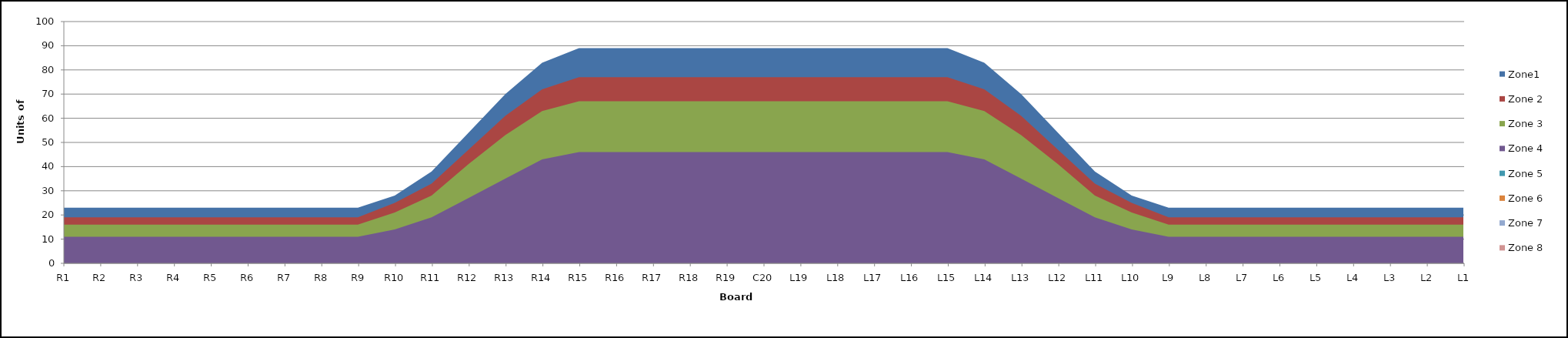
| Category | Zone1 | Zone 2 | Zone 3 | Zone 4 | Zone 5 | Zone 6 | Zone 7 | Zone 8 |
|---|---|---|---|---|---|---|---|---|
| L1 | 23 | 19 | 16 | 11 | 0 |  |  |  |
| L2 | 23 | 19 | 16 | 11 | 0 |  |  |  |
| L3 | 23 | 19 | 16 | 11 | 0 |  |  |  |
| L4 | 23 | 19 | 16 | 11 | 0 |  |  |  |
| L5 | 23 | 19 | 16 | 11 | 0 |  |  |  |
| L6 | 23 | 19 | 16 | 11 | 0 |  |  |  |
| L7 | 23 | 19 | 16 | 11 | 0 |  |  |  |
| L8 | 23 | 19 | 16 | 11 | 0 |  |  |  |
| L9 | 23 | 19 | 16 | 11 | 0 |  |  |  |
| L10 | 28 | 25 | 21 | 14 | 0 |  |  |  |
| L11 | 38 | 33 | 28 | 19 | 0 |  |  |  |
| L12 | 54 | 47 | 41 | 27 | 0 |  |  |  |
| L13 | 70 | 61 | 53 | 35 | 0 |  |  |  |
| L14 | 83 | 72 | 63 | 43 | 0 |  |  |  |
| L15 | 89 | 77 | 67 | 46 | 0 |  |  |  |
| L16 | 89 | 77 | 67 | 46 | 0 |  |  |  |
| L17 | 89 | 77 | 67 | 46 | 0 |  |  |  |
| L18 | 89 | 77 | 67 | 46 | 0 |  |  |  |
| L19 | 89 | 77 | 67 | 46 | 0 |  |  |  |
| C20 | 89 | 77 | 67 | 46 | 0 |  |  |  |
| R19 | 89 | 77 | 67 | 46 | 0 |  |  |  |
| R18 | 89 | 77 | 67 | 46 | 0 |  |  |  |
| R17 | 89 | 77 | 67 | 46 | 0 |  |  |  |
| R16 | 89 | 77 | 67 | 46 | 0 |  |  |  |
| R15 | 89 | 77 | 67 | 46 | 0 |  |  |  |
| R14 | 83 | 72 | 63 | 43 | 0 |  |  |  |
| R13 | 70 | 61 | 53 | 35 | 0 |  |  |  |
| R12 | 54 | 47 | 41 | 27 | 0 |  |  |  |
| R11 | 38 | 33 | 28 | 19 | 0 |  |  |  |
| R10 | 28 | 25 | 21 | 14 | 0 |  |  |  |
| R9 | 23 | 19 | 16 | 11 | 0 |  |  |  |
| R8 | 23 | 19 | 16 | 11 | 0 |  |  |  |
| R7 | 23 | 19 | 16 | 11 | 0 |  |  |  |
| R6 | 23 | 19 | 16 | 11 | 0 |  |  |  |
| R5 | 23 | 19 | 16 | 11 | 0 |  |  |  |
| R4 | 23 | 19 | 16 | 11 | 0 |  |  |  |
| R3 | 23 | 19 | 16 | 11 | 0 |  |  |  |
| R2 | 23 | 19 | 16 | 11 | 0 |  |  |  |
| R1 | 23 | 19 | 16 | 11 | 0 |  |  |  |